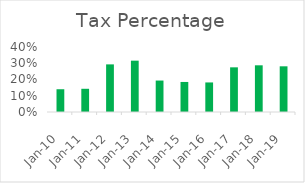
| Category | Tax% |
|---|---|
| 2010-03-31 | 0.14 |
| 2011-03-31 | 0.143 |
| 2012-03-31 | 0.293 |
| 2013-03-31 | 0.316 |
| 2014-03-31 | 0.194 |
| 2015-03-31 | 0.185 |
| 2016-03-31 | 0.182 |
| 2017-03-31 | 0.275 |
| 2018-03-31 | 0.287 |
| 2019-03-31 | 0.281 |